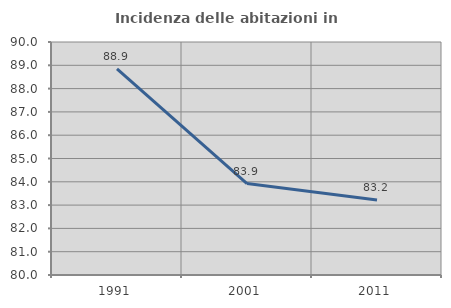
| Category | Incidenza delle abitazioni in proprietà  |
|---|---|
| 1991.0 | 88.851 |
| 2001.0 | 83.923 |
| 2011.0 | 83.217 |